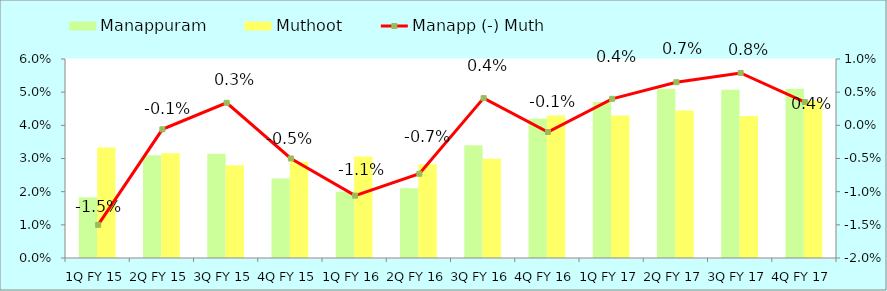
| Category | Manappuram | Muthoot |
|---|---|---|
| 1Q FY 15 | 0.018 | 0.033 |
| 2Q FY 15 | 0.031 | 0.032 |
| 3Q FY 15 | 0.031 | 0.028 |
| 4Q FY 15 | 0.024 | 0.029 |
| 1Q FY 16 | 0.02 | 0.031 |
| 2Q FY 16 | 0.021 | 0.028 |
| 3Q FY 16 | 0.034 | 0.03 |
| 4Q FY 16 | 0.042 | 0.043 |
| 1Q FY 17 | 0.047 | 0.043 |
| 2Q FY 17 | 0.051 | 0.044 |
| 3Q FY 17 | 0.051 | 0.043 |
| 4Q FY 17 | 0.051 | 0.048 |